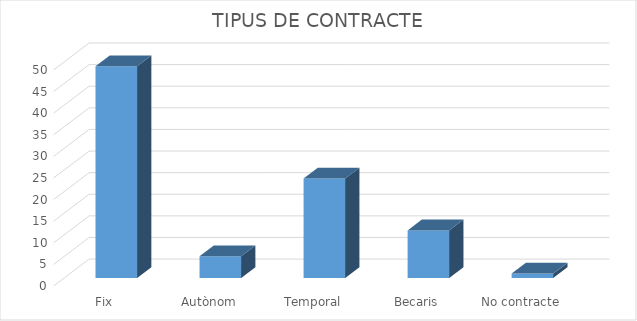
| Category | Series 0 |
|---|---|
| Fix | 49 |
| Autònom | 5 |
| Temporal | 23 |
| Becaris | 11 |
| No contracte | 1 |